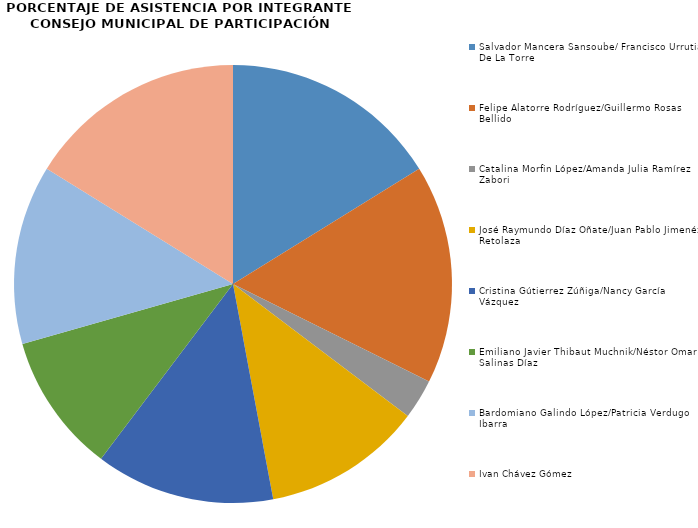
| Category | Series 0 |
|---|---|
| Salvador Mancera Sansoube/ Francisco Urrutia De La Torre | 11 |
| Felipe Alatorre Rodríguez/Guillermo Rosas Bellido | 11 |
| Catalina Morfin López/Amanda Julia Ramírez Zabori | 2 |
| José Raymundo Díaz Oñate/Juan Pablo Jimenéz Retolaza | 8 |
| Cristina Gútierrez Zúñiga/Nancy García Vázquez | 9 |
| Emiliano Javier Thibaut Muchnik/Néstor Omar Salinas Díaz | 7 |
| Bardomiano Galindo López/Patricia Verdugo Ibarra | 9 |
| Ivan Chávez Gómez | 11 |